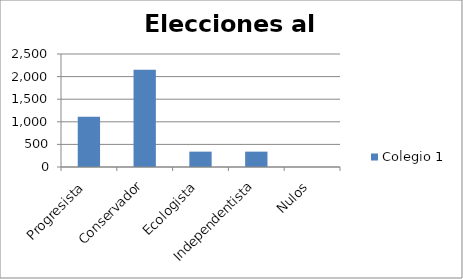
| Category | Colegio 1 |
|---|---|
| Progresista | 1110 |
| Conservador | 2150 |
| Ecologista | 340 |
| Independentista | 340 |
| Nulos | 0 |